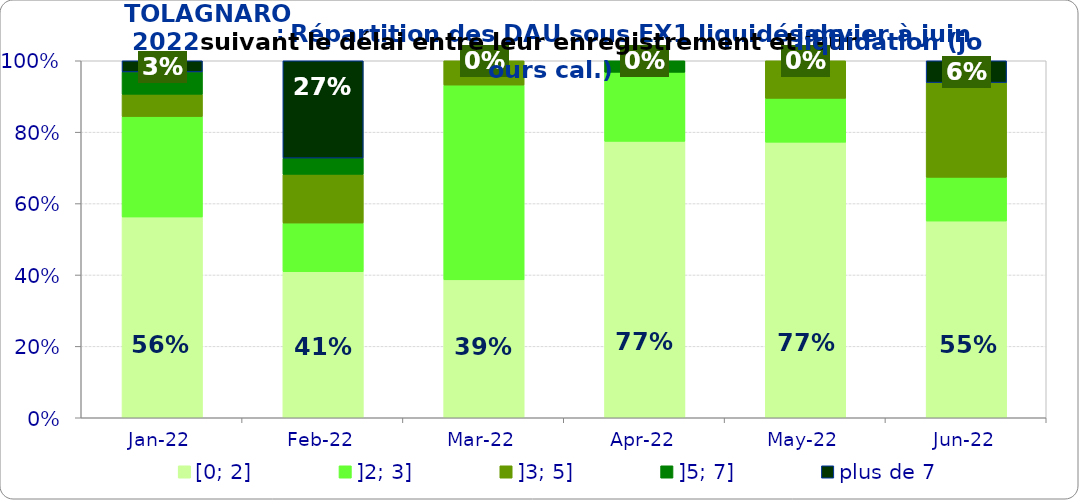
| Category | [0; 2] | ]2; 3] | ]3; 5] | ]5; 7] | plus de 7 |
|---|---|---|---|---|---|
| 2022-01-01 | 0.562 | 0.281 | 0.062 | 0.062 | 0.031 |
| 2022-02-01 | 0.409 | 0.136 | 0.136 | 0.045 | 0.273 |
| 2022-03-01 | 0.386 | 0.545 | 0.068 | 0 | 0 |
| 2022-04-01 | 0.774 | 0.194 | 0 | 0.032 | 0 |
| 2022-05-01 | 0.772 | 0.123 | 0.105 | 0 | 0 |
| 2022-06-01 | 0.551 | 0.122 | 0.265 | 0 | 0.061 |